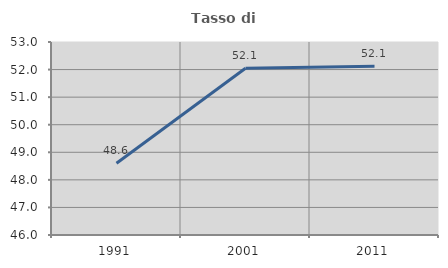
| Category | Tasso di occupazione   |
|---|---|
| 1991.0 | 48.604 |
| 2001.0 | 52.05 |
| 2011.0 | 52.118 |